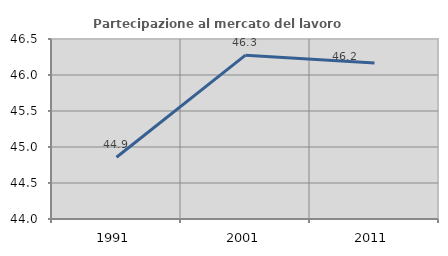
| Category | Partecipazione al mercato del lavoro  femminile |
|---|---|
| 1991.0 | 44.858 |
| 2001.0 | 46.275 |
| 2011.0 | 46.166 |